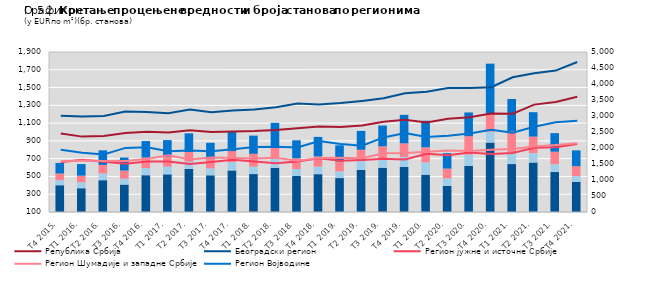
| Category | Series 5 | Series 6 | Series 7 | Series 8 |
|---|---|---|---|---|
| Т4 2015. | 837 | 158 | 207 | 331 |
| Т1 2016. | 743 | 184 | 209 | 362 |
| Т2 2016. | 994 | 209 | 270 | 454 |
| Т3 2016. | 857 | 180 | 258 | 406 |
| Т4 2016. | 1150 | 224 | 329 | 514 |
| Т1 2017. | 1178 | 239 | 302 | 528 |
| Т2 2017. | 1348 | 226 | 302 | 582 |
| Т3 2017. | 1147 | 217 | 297 | 502 |
| Т4 2017. | 1299 | 259 | 344 | 629 |
| Т1 2018. | 1185 | 231 | 402 | 569 |
| Т2 2018. | 1381 | 295 | 386 | 725 |
| Т3 2018. | 1125 | 218 | 337 | 561 |
| Т4 2018. | 1183 | 234 | 320 | 610 |
| Т1 2019. | 1060 | 209 | 311 | 504 |
| Т2 2019. | 1318 | 271 | 356 | 589 |
| Т3 2019. | 1384 | 282 | 386 | 650 |
| Т4 2019. | 1407 | 314 | 424 | 891 |
| Т1 2020. | 1166 | 385 | 470 | 831 |
| Т2 2020. | 818 | 230 | 309 | 483 |
| Т3 2020. | 1442 | 357 | 569 | 743 |
| Т4 2020. | 2171 | 338 | 563 | 1564 |
| T1 2021. | 1498 | 360 | 665 | 1009 |
| T2 2021. | 1547 | 292 | 516 | 764 |
| Т3 2021. | 1249 | 241 | 395 | 579 |
| Т4 2021. | 945 | 175 | 310 | 495 |